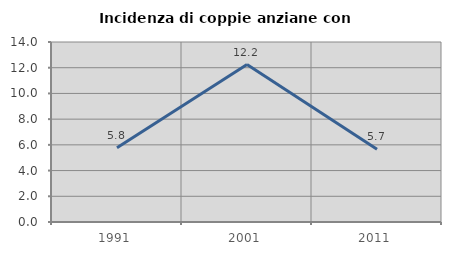
| Category | Incidenza di coppie anziane con figli |
|---|---|
| 1991.0 | 5.769 |
| 2001.0 | 12.245 |
| 2011.0 | 5.66 |